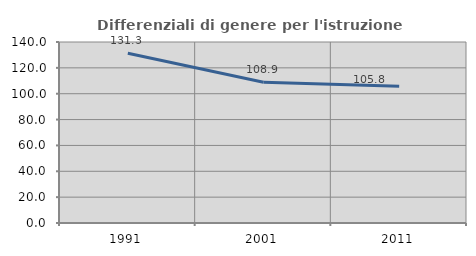
| Category | Differenziali di genere per l'istruzione superiore |
|---|---|
| 1991.0 | 131.309 |
| 2001.0 | 108.917 |
| 2011.0 | 105.763 |